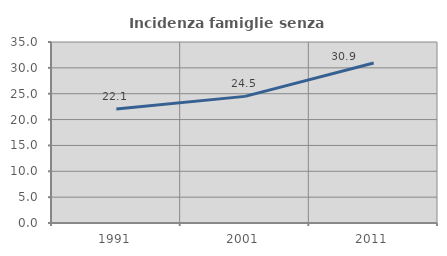
| Category | Incidenza famiglie senza nuclei |
|---|---|
| 1991.0 | 22.057 |
| 2001.0 | 24.484 |
| 2011.0 | 30.938 |